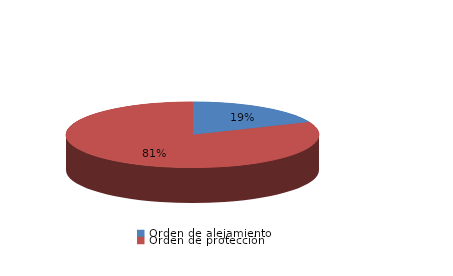
| Category | Series 0 |
|---|---|
| Orden de alejamiento | 16 |
| Orden de protección | 70 |